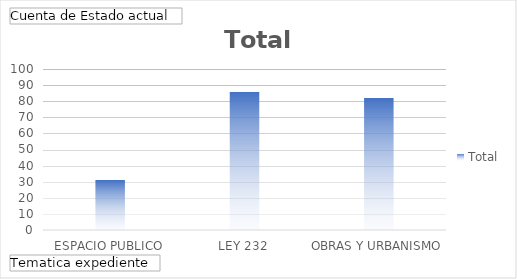
| Category | Total |
|---|---|
| ESPACIO PUBLICO | 31 |
| LEY 232 | 86 |
| OBRAS Y URBANISMO | 82 |